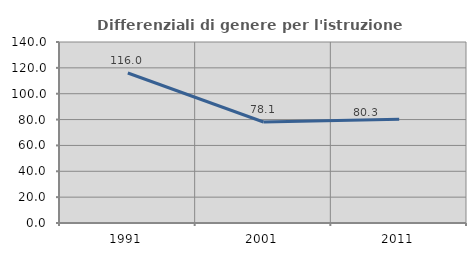
| Category | Differenziali di genere per l'istruzione superiore |
|---|---|
| 1991.0 | 116.008 |
| 2001.0 | 78.112 |
| 2011.0 | 80.266 |